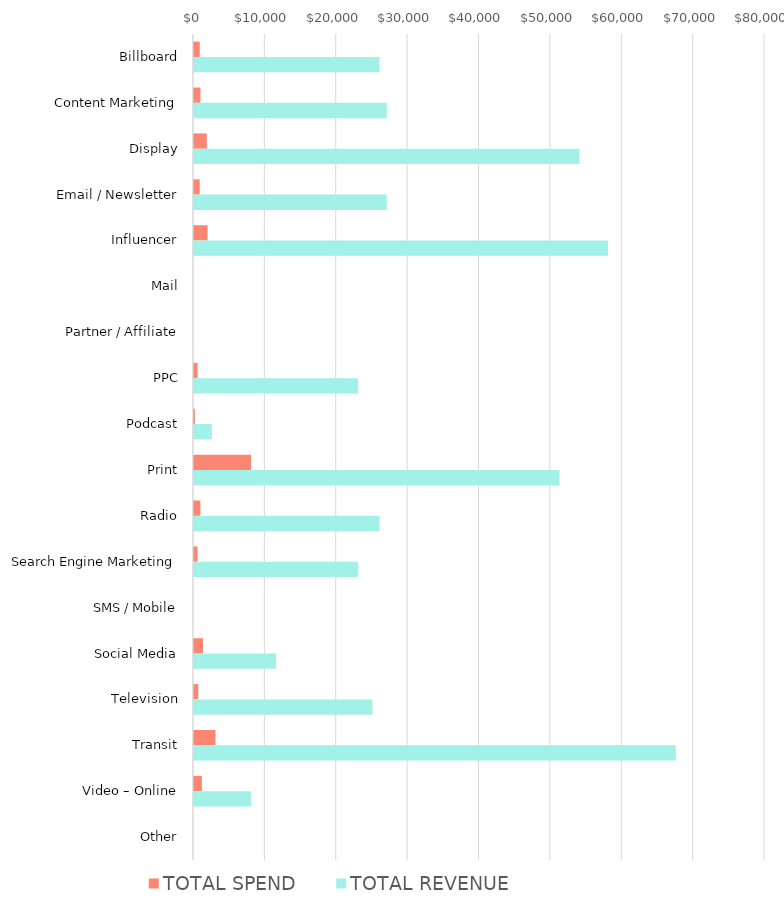
| Category | TOTAL SPEND | TOTAL REVENUE |
|---|---|---|
| Billboard | 800 | 26000 |
| Content Marketing | 900 | 27000 |
| Display | 1800 | 54000 |
| Email / Newsletter | 800 | 27000 |
| Influencer | 1900 | 58000 |
| Mail | 0 | 0 |
| Partner / Affiliate | 0 | 0 |
| PPC | 500 | 23000 |
| Podcast | 123 | 2500 |
| Print | 8000 | 51200 |
| Radio | 900 | 26000 |
| Search Engine Marketing | 500 | 23000 |
| SMS / Mobile | 0 | 0 |
| Social Media | 1256 | 11500 |
| Television | 600 | 25000 |
| Transit | 3000 | 67500 |
| Video – Online | 1100 | 8000 |
| Other | 0 | 0 |